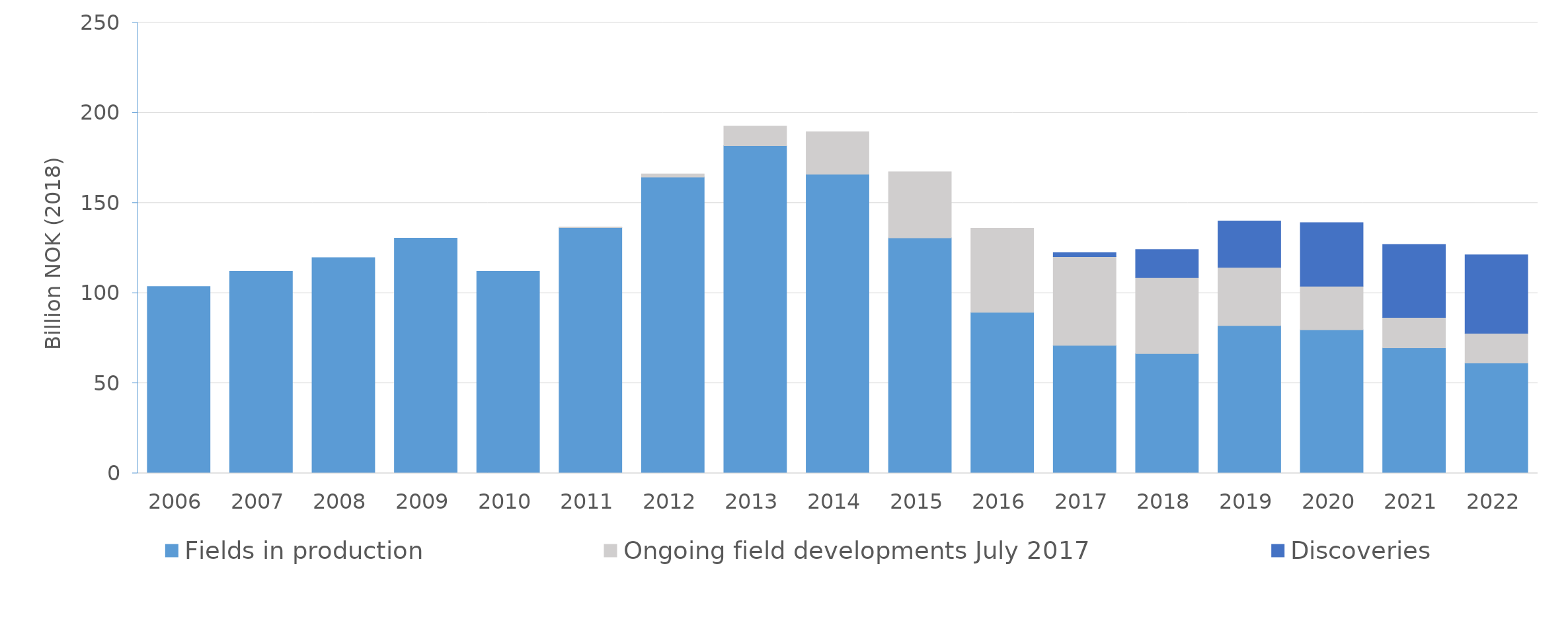
| Category | Fields in production | Ongoing field developments July 2017 | Discoveries |
|---|---|---|---|
| 2006.0 | 103.686 | 0 | 0 |
| 2007.0 | 112.216 | 0 | 0 |
| 2008.0 | 119.715 | 0 | 0 |
| 2009.0 | 130.506 | 0 | 0 |
| 2010.0 | 112.198 | 0 | 0 |
| 2011.0 | 136.392 | 0.236 | 0 |
| 2012.0 | 164.445 | 1.665 | 0 |
| 2013.0 | 181.815 | 10.851 | 0 |
| 2014.0 | 165.976 | 23.507 | 0 |
| 2015.0 | 130.657 | 36.725 | 0 |
| 2016.0 | 89.327 | 46.663 | 0 |
| 2017.0 | 70.998 | 49.21 | 2.184 |
| 2018.0 | 66.45 | 42.103 | 15.58 |
| 2019.0 | 81.989 | 32.328 | 25.751 |
| 2020.0 | 79.615 | 24.208 | 35.254 |
| 2021.0 | 69.634 | 16.889 | 40.533 |
| 2022.0 | 61.193 | 16.556 | 43.47 |